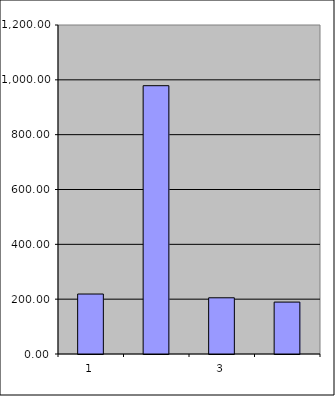
| Category | Series 0 |
|---|---|
| 0 | 218.75 |
| 1 | 978.622 |
| 2 | 205.014 |
| 3 | 189.329 |